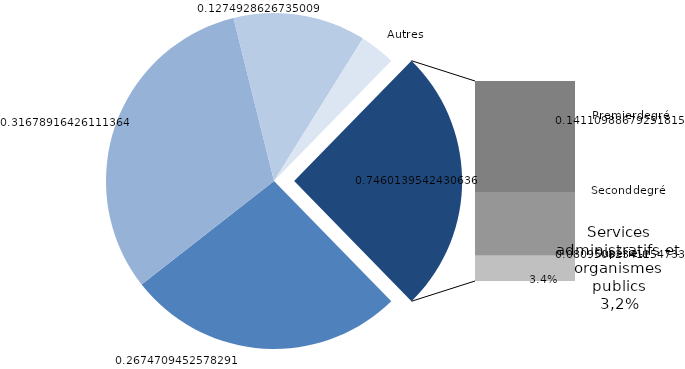
| Category | Series 0 |
|---|---|
| Établissements publics du premier degré | 41210.61 |
| Établissements publics du second degré | 48809.319 |
| Établissements publics du supérieur | 19643.474 |
| Autres établissements publics | 5278.746 |
| Établissements privés subventionnés | 21741.519 |
| Établissements privés non subventionnés | 12472.505 |
| Services administratifs et organismes publics | 4918.917 |